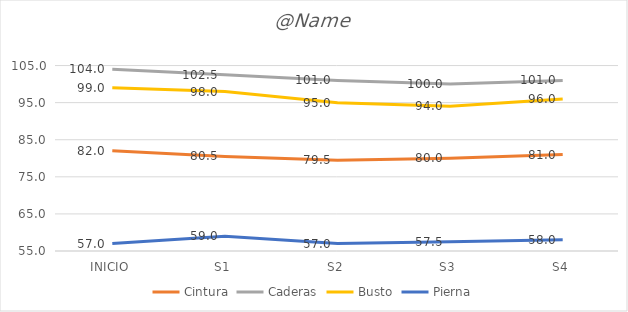
| Category | Cintura | Caderas | Busto | Pierna |
|---|---|---|---|---|
| INICIO | 82 | 104 | 99 | 57 |
| S1 | 80.5 | 102.5 | 98 | 59 |
| S2 | 79.5 | 101 | 95 | 57 |
| S3 | 80 | 100 | 94 | 57.5 |
| S4 | 81 | 101 | 96 | 58 |